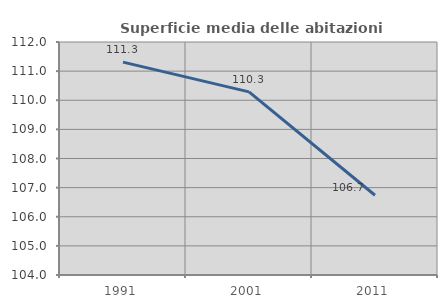
| Category | Superficie media delle abitazioni occupate |
|---|---|
| 1991.0 | 111.308 |
| 2001.0 | 110.287 |
| 2011.0 | 106.739 |